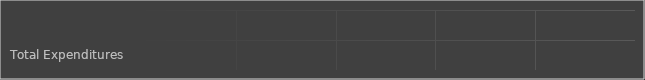
| Category | Series 0 |
|---|---|
| Total Expenditures | 0 |